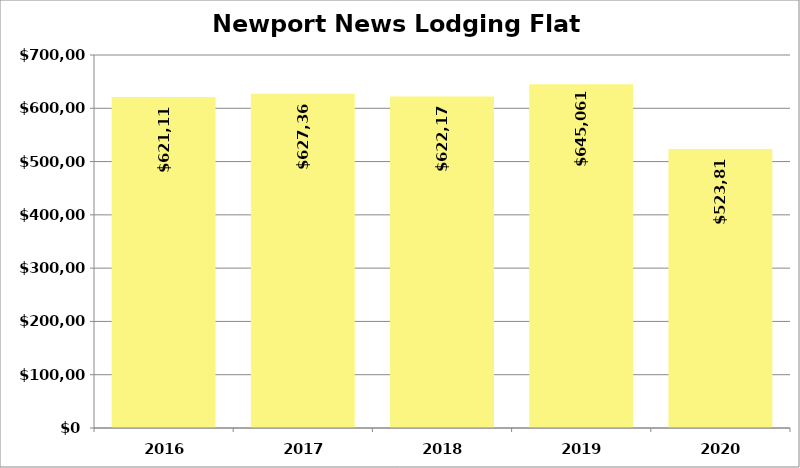
| Category | Series 1 |
|---|---|
| 2016.0 | 621117 |
| 2017.0 | 627361.88 |
| 2018.0 | 622173.66 |
| 2019.0 | 645061 |
| 2020.0 | 523816.29 |